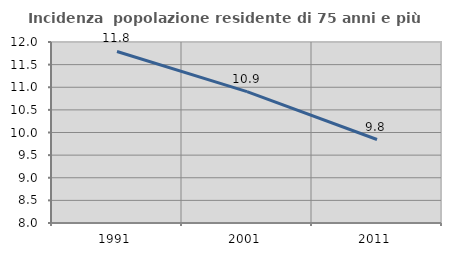
| Category | Incidenza  popolazione residente di 75 anni e più |
|---|---|
| 1991.0 | 11.791 |
| 2001.0 | 10.902 |
| 2011.0 | 9.845 |